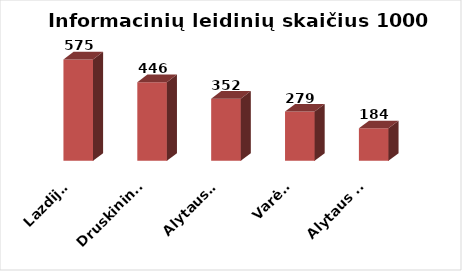
| Category | Series 0 |
|---|---|
| Lazdijai | 574.5 |
| Druskininkai | 445.769 |
| Alytaus r. | 352.057 |
| Varėna | 279.121 |
| Alytaus m. | 184.187 |